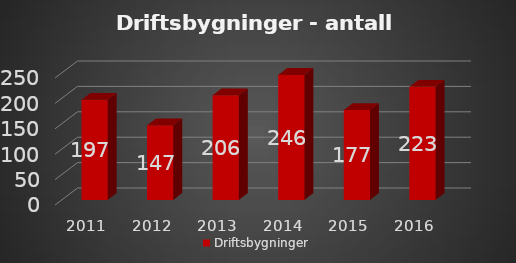
| Category | Driftsbygninger |
|---|---|
| 2011.0 | 197 |
| 2012.0 | 147 |
| 2013.0 | 206 |
| 2014.0 | 246 |
| 2015.0 | 177 |
| 2016.0 | 222.633 |